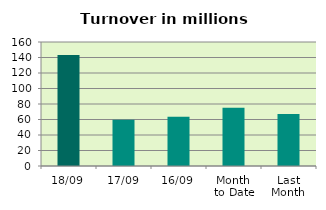
| Category | Series 0 |
|---|---|
| 18/09 | 143.241 |
| 17/09 | 59.807 |
| 16/09 | 63.393 |
| Month 
to Date | 75.116 |
| Last
Month | 66.948 |